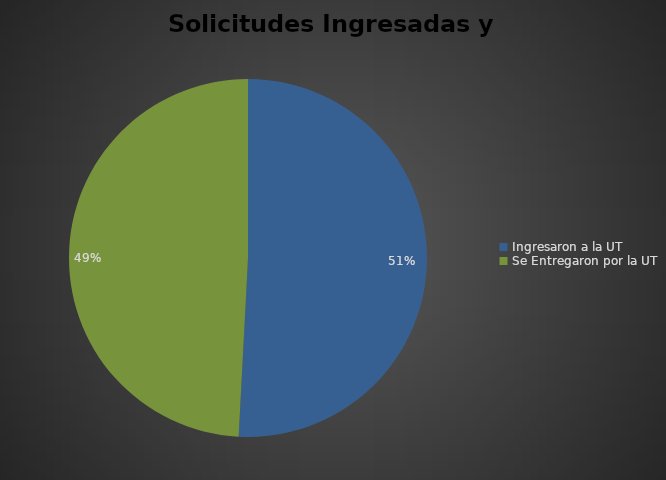
| Category | Series 0 |
|---|---|
| Ingresaron a la UT | 306 |
| Se Entregaron por la UT | 296 |